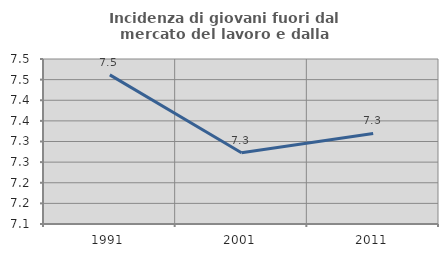
| Category | Incidenza di giovani fuori dal mercato del lavoro e dalla formazione  |
|---|---|
| 1991.0 | 7.462 |
| 2001.0 | 7.273 |
| 2011.0 | 7.319 |